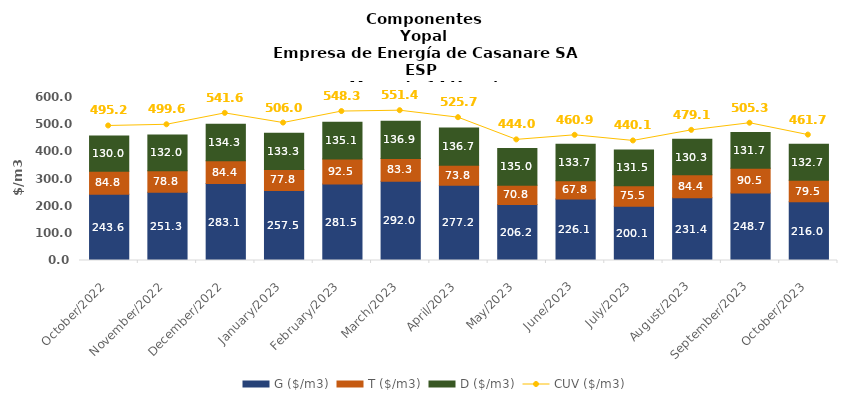
| Category | G ($/m3) | T ($/m3) | D ($/m3) |
|---|---|---|---|
| 2022-10-01 | 243.58 | 84.76 | 129.96 |
| 2022-11-01 | 251.27 | 78.75 | 131.99 |
| 2022-12-01 | 283.07 | 84.41 | 134.3 |
| 2023-01-01 | 257.508 | 77.815 | 133.258 |
| 2023-02-01 | 281.451 | 92.545 | 135.074 |
| 2023-03-01 | 292.028 | 83.345 | 136.946 |
| 2023-04-01 | 277.158 | 73.848 | 136.749 |
| 2023-05-01 | 206.218 | 70.832 | 134.954 |
| 2023-06-01 | 226.097 | 67.766 | 133.705 |
| 2023-07-01 | 200.103 | 75.481 | 131.466 |
| 2023-08-01 | 231.393 | 84.415 | 130.283 |
| 2023-09-01 | 248.694 | 90.492 | 131.705 |
| 2023-10-01 | 216.024 | 79.542 | 132.704 |